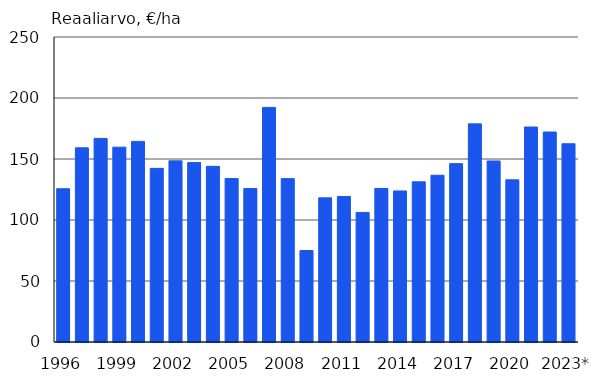
| Category | Reaaliarvo, €/ha |
|---|---|
| 1996 | 125.639 |
| 1997 | 159.179 |
| 1998 | 166.88 |
| 1999 | 159.708 |
| 2000 | 164.437 |
| 2001 | 142.325 |
| 2002 | 148.513 |
| 2003 | 147.049 |
| 2004 | 144.009 |
| 2005 | 133.957 |
| 2006 | 125.841 |
| 2007 | 192.3 |
| 2008 | 133.911 |
| 2009 | 74.985 |
| 2010 | 118.144 |
| 2011 | 119.235 |
| 2012 | 106.235 |
| 2013 | 125.855 |
| 2014 | 123.816 |
| 2015 | 131.303 |
| 2016 | 136.704 |
| 2017 | 146.196 |
| 2018 | 178.8 |
| 2019 | 148.4 |
| 2020 | 132.945 |
| 2021 | 176.213 |
| 2022 | 172.12 |
| 2023* | 162.5 |